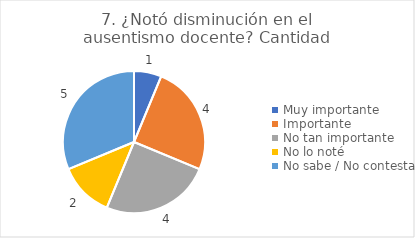
| Category | 7. ¿Notó disminución en el ausentismo docente? |
|---|---|
| Muy importante  | 0.062 |
| Importante  | 0.25 |
| No tan importante  | 0.25 |
| No lo noté  | 0.125 |
| No sabe / No contesta | 0.312 |